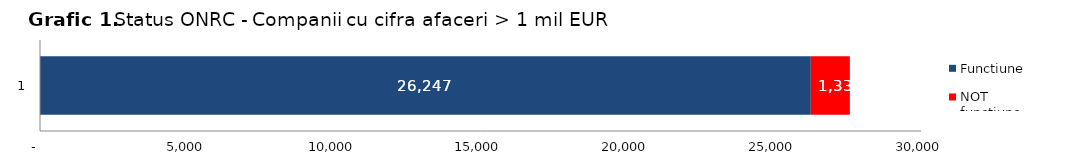
| Category | Functiune  | NOT functiune |
|---|---|---|
| 0 | 26247 | 1330 |